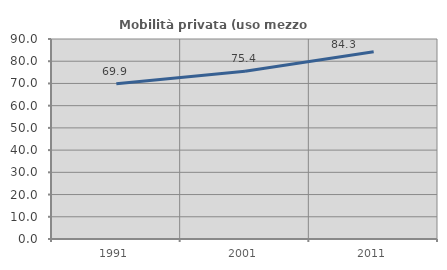
| Category | Mobilità privata (uso mezzo privato) |
|---|---|
| 1991.0 | 69.862 |
| 2001.0 | 75.449 |
| 2011.0 | 84.274 |